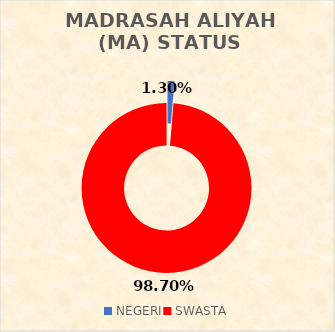
| Category | MADRASAH ALIYAH (MA) STATUS SEKOLAH |
|---|---|
| NEGERI | 1 |
| SWASTA | 76 |